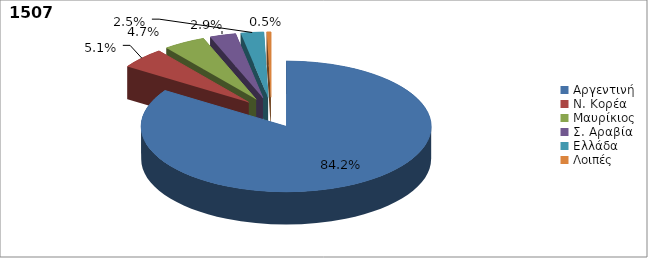
| Category | Series 0 |
|---|---|
| Αργεντινή  | 0.842 |
| Ν. Κορέα | 0.051 |
| Μαυρίκιος | 0.047 |
| Σ. Αραβία | 0.029 |
| Ελλάδα | 0.025 |
| Λοιπές | 0.005 |